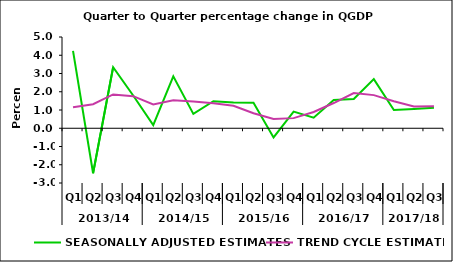
| Category | SEASONALLY ADJUSTED ESTIMATES | TREND CYCLE ESTIMATES |
|---|---|---|
| 0 | 4.24 | 1.145 |
| 1 | -2.464 | 1.314 |
| 2 | 3.342 | 1.855 |
| 3 | 1.794 | 1.758 |
| 4 | 0.17 | 1.305 |
| 5 | 2.848 | 1.533 |
| 6 | 0.785 | 1.467 |
| 7 | 1.485 | 1.367 |
| 8 | 1.404 | 1.234 |
| 9 | 1.394 | 0.825 |
| 10 | -0.504 | 0.505 |
| 11 | 0.914 | 0.555 |
| 12 | 0.578 | 0.893 |
| 13 | 1.551 | 1.382 |
| 14 | 1.607 | 1.93 |
| 15 | 2.693 | 1.815 |
| 16 | 0.998 | 1.481 |
| 17 | 1.059 | 1.193 |
| 18 | 1.125 | 1.199 |